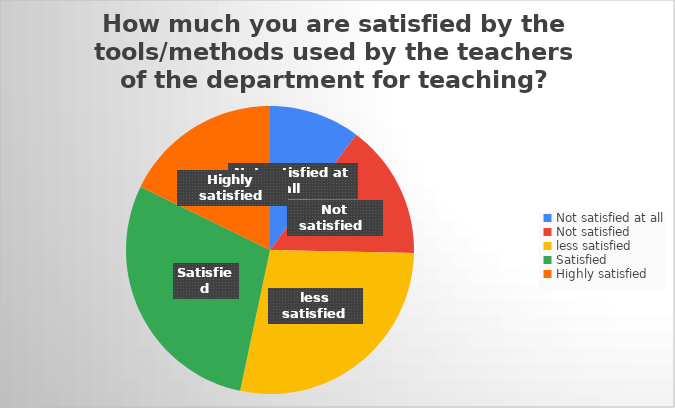
| Category | Series 0 |
|---|---|
| Not satisfied at all | 23 |
| Not satisfied  | 34 |
| less satisfied | 63 |
| Satisfied | 65 |
| Highly satisfied | 40 |